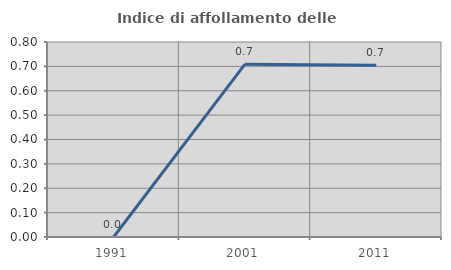
| Category | Indice di affollamento delle abitazioni  |
|---|---|
| 1991.0 | 0 |
| 2001.0 | 0.709 |
| 2011.0 | 0.704 |